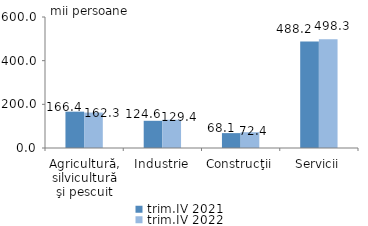
| Category | trim.IV 2021 | trim.IV 2022 |
|---|---|---|
| Agricultură, silvicultură şi pescuit | 166.424 | 162.344 |
| Industrie | 124.639 | 129.412 |
| Construcţii | 68.12 | 72.375 |
| Servicii | 488.217 | 498.316 |